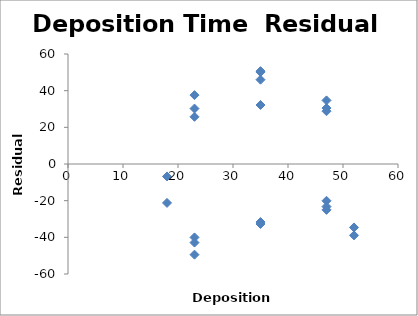
| Category | Series 0 |
|---|---|
| 18.0 | -6.787 |
| 35.0 | -31.654 |
| 52.0 | -34.608 |
| 52.0 | -38.93 |
| 18.0 | -21.224 |
| 35.0 | -32.714 |
| 35.0 | 32.188 |
| 35.0 | 50.156 |
| 23.0 | 25.75 |
| 23.0 | 30.255 |
| 47.0 | -20.064 |
| 47.0 | -25.011 |
| 47.0 | -23.219 |
| 23.0 | 37.571 |
| 23.0 | -40.045 |
| 23.0 | -49.45 |
| 23.0 | -42.861 |
| 47.0 | 28.812 |
| 47.0 | 30.506 |
| 47.0 | 34.694 |
| 35.0 | 50.649 |
| 35.0 | 45.987 |